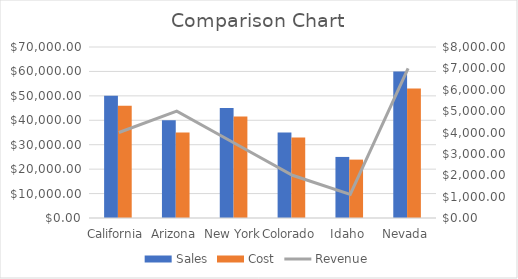
| Category | Sales | Cost |
|---|---|---|
| California | 50000 | 46000 |
| Arizona | 40000 | 35000 |
| New York | 45000 | 41500 |
| Colorado | 35000 | 33000 |
| Idaho | 25000 | 23900 |
| Nevada | 60000 | 53000 |